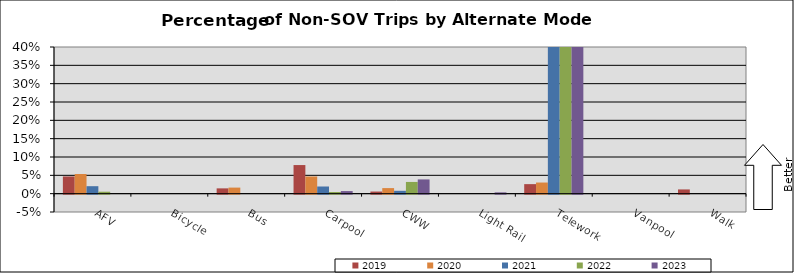
| Category | 2019 | 2020 | 2021 | 2022 | 2023 |
|---|---|---|---|---|---|
| AFV | 0.047 | 0.054 | 0.02 | 0.005 | 0 |
| Bicycle | 0 | 0 | 0 | 0 | 0 |
| Bus | 0.014 | 0.017 | 0 | 0 | 0 |
| Carpool | 0.078 | 0.047 | 0.02 | 0.005 | 0.007 |
| CWW | 0.006 | 0.015 | 0.008 | 0.032 | 0.039 |
| Light Rail | 0 | 0 | 0 | 0 | 0.004 |
| Telework | 0.026 | 0.03 | 0.508 | 0.594 | 0.608 |
| Vanpool | 0 | 0 | 0 | 0 | 0 |
| Walk | 0.012 | 0 | 0 | 0 | 0 |